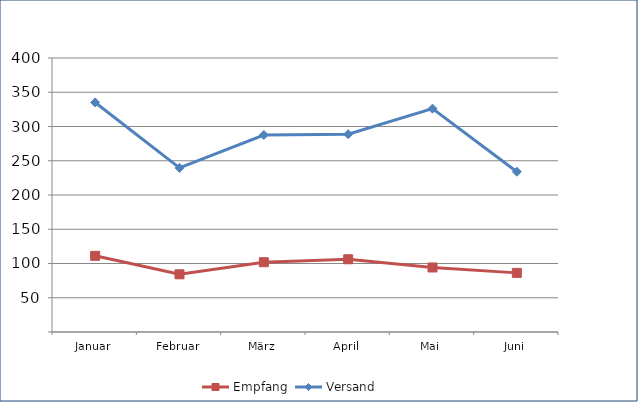
| Category | Empfang | Versand |
|---|---|---|
| Januar | 111.21 | 335.123 |
| Februar | 84.22 | 239.579 |
| März | 101.877 | 287.605 |
| April | 106.173 | 288.786 |
| Mai | 94.185 | 326.067 |
| Juni | 86.312 | 234.001 |